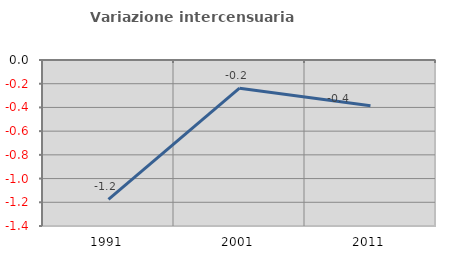
| Category | Variazione intercensuaria annua |
|---|---|
| 1991.0 | -1.176 |
| 2001.0 | -0.238 |
| 2011.0 | -0.385 |